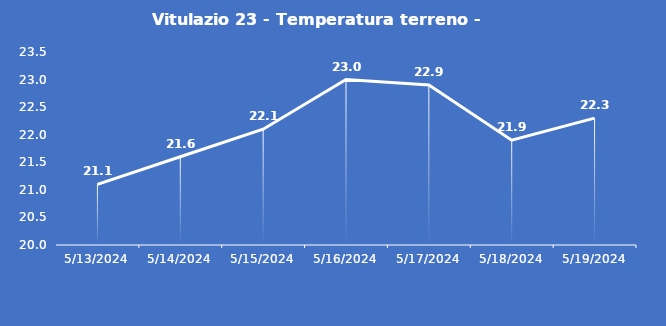
| Category | Vitulazio 23 - Temperatura terreno - Grezzo (°C) |
|---|---|
| 5/13/24 | 21.1 |
| 5/14/24 | 21.6 |
| 5/15/24 | 22.1 |
| 5/16/24 | 23 |
| 5/17/24 | 22.9 |
| 5/18/24 | 21.9 |
| 5/19/24 | 22.3 |